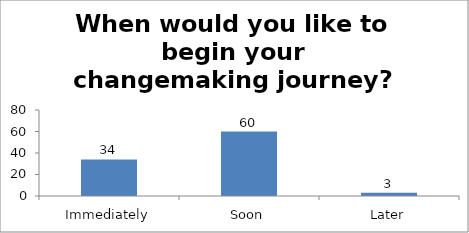
| Category | When would you like to begin your changemaking journey?  |
|---|---|
| Immediately | 34 |
| Soon | 60 |
| Later | 3 |